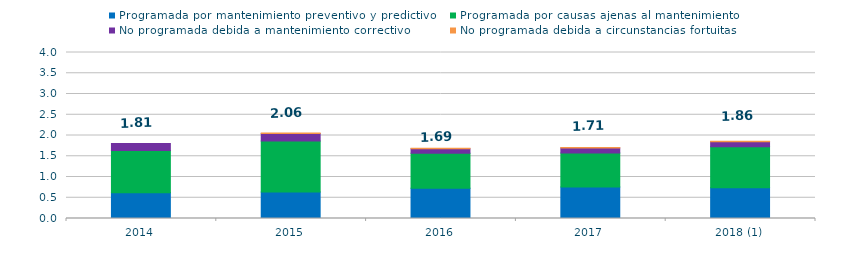
| Category | Programada por mantenimiento preventivo y predictivo | Programada por causas ajenas al mantenimiento  | No programada debida a mantenimiento correctivo  | No programada debida a circunstancias fortuitas  |
|---|---|---|---|---|
| 2014 | 0.62 | 1.02 | 0.17 | 0 |
| 2015 | 0.64 | 1.23 | 0.18 | 0.01 |
| 2016 | 0.73 | 0.84 | 0.11 | 0.01 |
| 2017 | 0.76 | 0.82 | 0.12 | 0.01 |
| 2018 (1) | 0.74 | 0.99 | 0.12 | 0.01 |